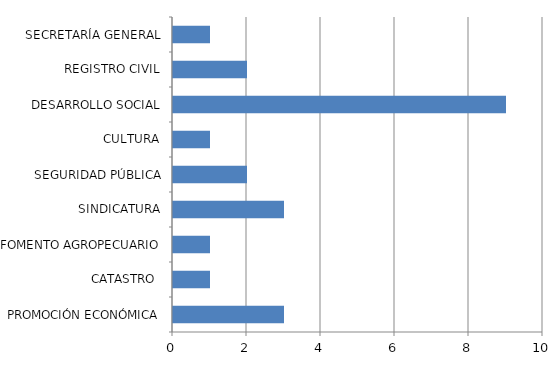
| Category | Series 0 |
|---|---|
| PROMOCIÓN ECONÓMICA | 3 |
| CATASTRO  | 1 |
| FOMENTO AGROPECUARIO | 1 |
| SINDICATURA | 3 |
| SEGURIDAD PÚBLICA | 2 |
| CULTURA | 1 |
| DESARROLLO SOCIAL | 9 |
| REGISTRO CIVIL | 2 |
| SECRETARÍA GENERAL | 1 |